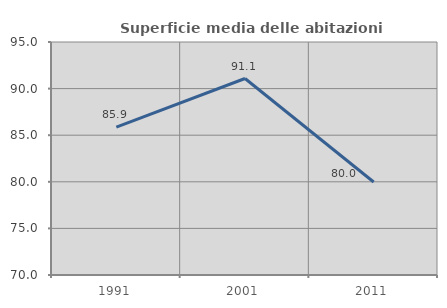
| Category | Superficie media delle abitazioni occupate |
|---|---|
| 1991.0 | 85.871 |
| 2001.0 | 91.082 |
| 2011.0 | 79.981 |